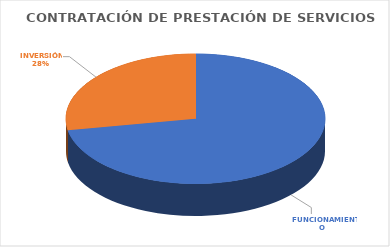
| Category | Series 0 |
|---|---|
|  FUNCIONAMIENTO  | 83830139316.24 |
|  INVERSIÓN  | 32352916423.64 |